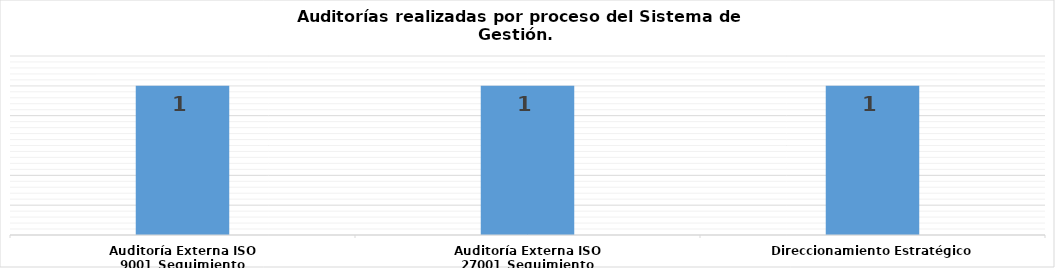
| Category | Total |
|---|---|
| Auditoría Externa ISO 9001_Seguimiento | 1 |
| Auditoría Externa ISO 27001_Seguimiento | 1 |
| Direccionamiento Estratégico | 1 |